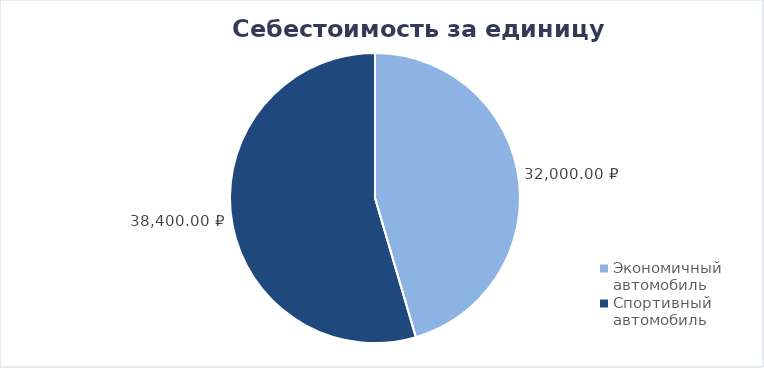
| Category | Series 0 |
|---|---|
| Экономичный автомобиль | 32000 |
| Спортивный автомобиль | 38400 |